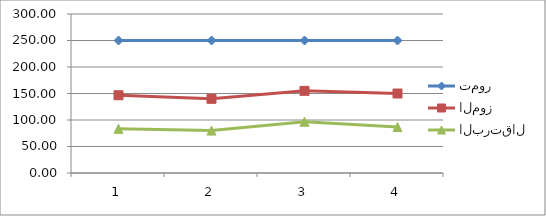
| Category | تمور | الموز | البرتقال |
|---|---|---|---|
| 0 | 250 | 146.67 | 83.33 |
| 1 | 250 | 140 | 80 |
| 2 | 250 | 155 | 96.67 |
| 3 | 250 | 150 | 86.67 |